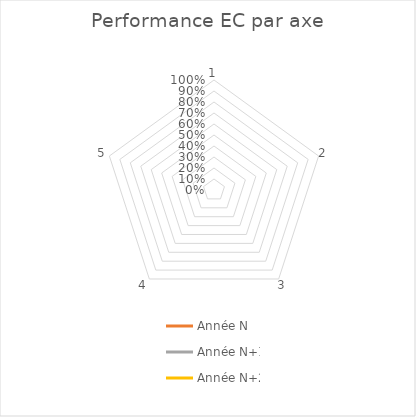
| Category | Année N | Année N+1 | Année N+2 |
|---|---|---|---|
| 1.0 | 0 | 0 | 0 |
| 2.0 | 0 | 0 | 0 |
| 3.0 | 0 | 0 | 0 |
| 4.0 | 0 | 0 | 0 |
| 5.0 | 0 | 0 | 0 |